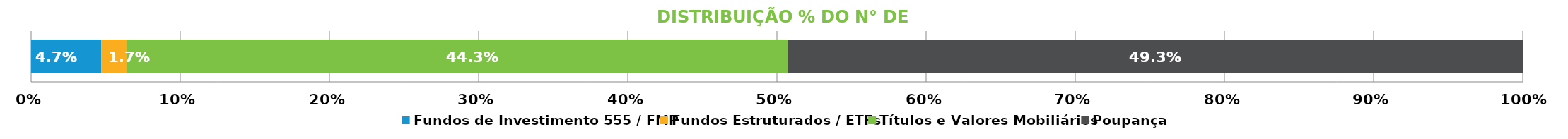
| Category | Fundos de Investimento 555 / FMP | Fundos Estruturados / ETFs | Títulos e Valores Mobiliários | Poupança |
|---|---|---|---|---|
| 0 | 0.047 | 0.017 | 0.443 | 0.493 |